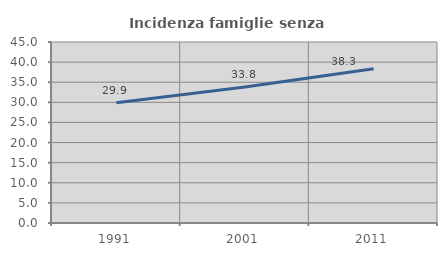
| Category | Incidenza famiglie senza nuclei |
|---|---|
| 1991.0 | 29.897 |
| 2001.0 | 33.803 |
| 2011.0 | 38.323 |